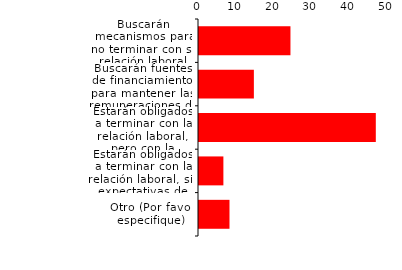
| Category | Buscarán mecanismos para no terminar con su relación laboral, aunque sin poder mantener sus remuneraciones |
|---|---|
| Buscarán mecanismos para no terminar con su relación laboral, aunque sin poder mantener sus remuneraciones | 24.194 |
| Buscarán fuentes de financiamiento para mantener las remuneraciones de los trabajadores | 14.516 |
| Estarán obligados a terminar con la relación laboral, pero con la expectativa de reincorporarlos en el futuro | 46.774 |
| Estarán obligados a terminar con la relación laboral, sin expectativas de reincorporarlos en el futuro | 6.452 |
| Otro (Por favor especifique) | 8.065 |